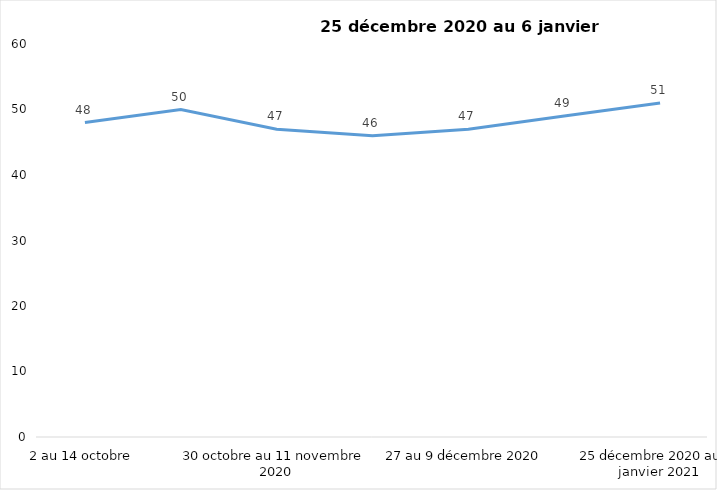
| Category | Toujours aux trois mesures |
|---|---|
| 2 au 14 octobre | 48 |
| 16 au 28 octobre 2020 | 50 |
| 30 octobre au 11 novembre 2020 | 47 |
| 13 au 25 novembre 2020 | 46 |
| 27 au 9 décembre 2020 | 47 |
| 11 au 25 décembre 2020 | 49 |
| 25 décembre 2020 au 6 janvier 2021 | 51 |